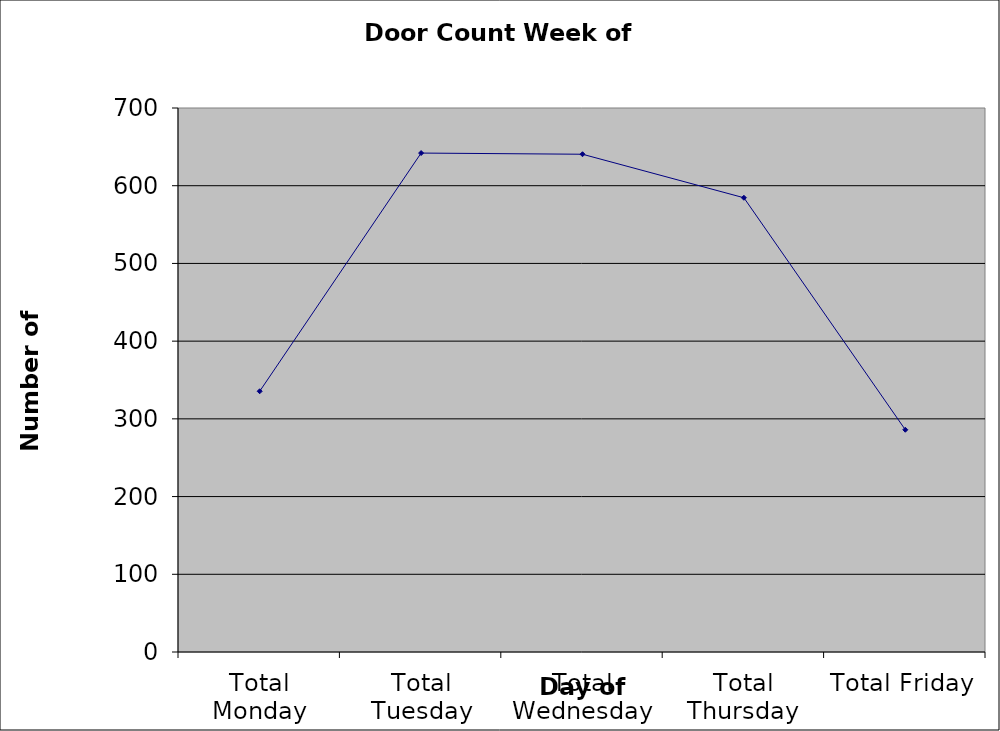
| Category | Series 0 |
|---|---|
| Total Monday | 335.5 |
| Total Tuesday | 642 |
| Total Wednesday | 640.5 |
| Total Thursday | 584.5 |
| Total Friday | 286 |